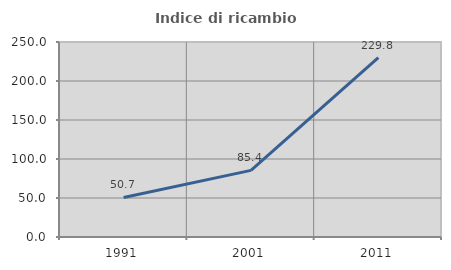
| Category | Indice di ricambio occupazionale  |
|---|---|
| 1991.0 | 50.663 |
| 2001.0 | 85.423 |
| 2011.0 | 229.847 |